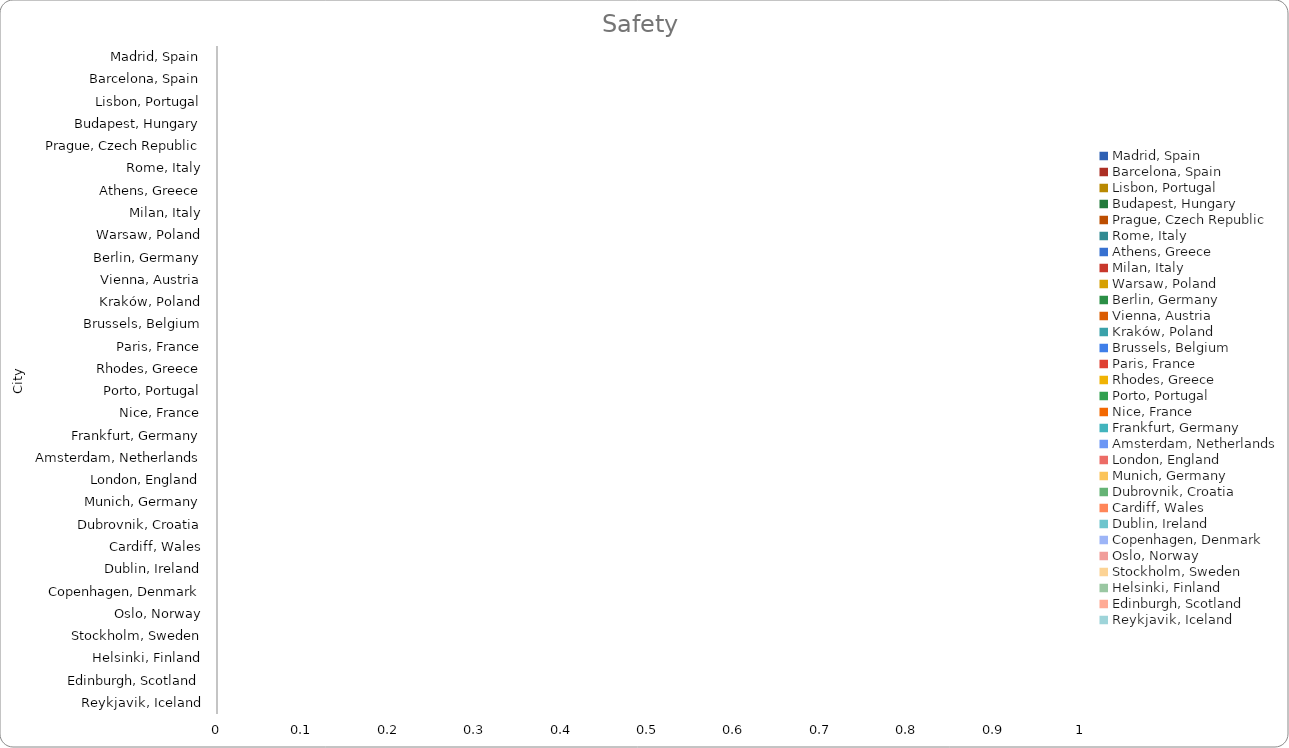
| Category | City |
|---|---|
| Madrid, Spain | 0 |
| Barcelona, Spain | 0 |
| Lisbon, Portugal | 0 |
| Budapest, Hungary | 0 |
| Prague, Czech Republic | 0 |
| Rome, Italy | 0 |
| Athens, Greece | 0 |
| Milan, Italy | 0 |
| Warsaw, Poland | 0 |
| Berlin, Germany | 0 |
| Vienna, Austria | 0 |
| Kraków, Poland | 0 |
| Brussels, Belgium | 0 |
| Paris, France | 0 |
| Rhodes, Greece | 0 |
| Porto, Portugal | 0 |
| Nice, France | 0 |
| Frankfurt, Germany | 0 |
| Amsterdam, Netherlands | 0 |
| London, England | 0 |
| Munich, Germany | 0 |
| Dubrovnik, Croatia | 0 |
| Cardiff, Wales | 0 |
| Dublin, Ireland | 0 |
| Copenhagen, Denmark | 0 |
| Oslo, Norway | 0 |
| Stockholm, Sweden | 0 |
| Helsinki, Finland | 0 |
| Edinburgh, Scotland | 0 |
| Reykjavik, Iceland | 0 |